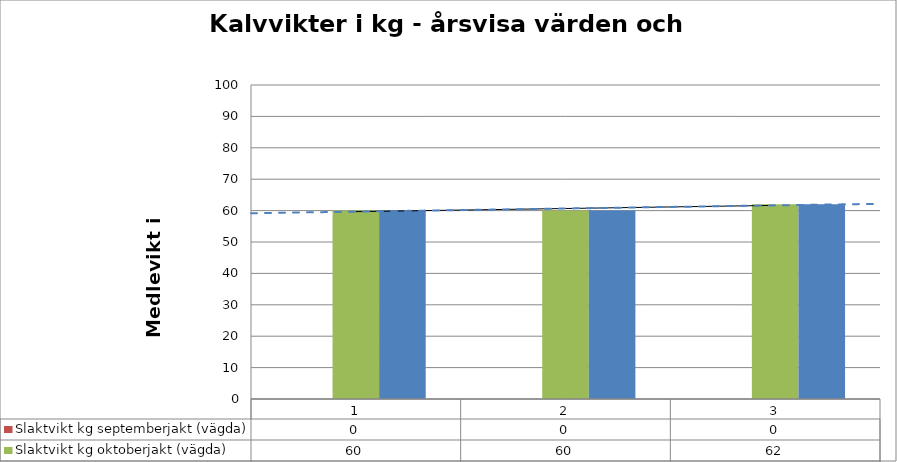
| Category | Slaktvikt kg septemberjakt (vägda) | Slaktvikt kg oktoberjakt (vägda) | Slaktvikt kg medel (vägda) |
|---|---|---|---|
| 0 | 0 | 60 | 60 |
| 1 | 0 | 60 | 60 |
| 2 | 0 | 62 | 62 |